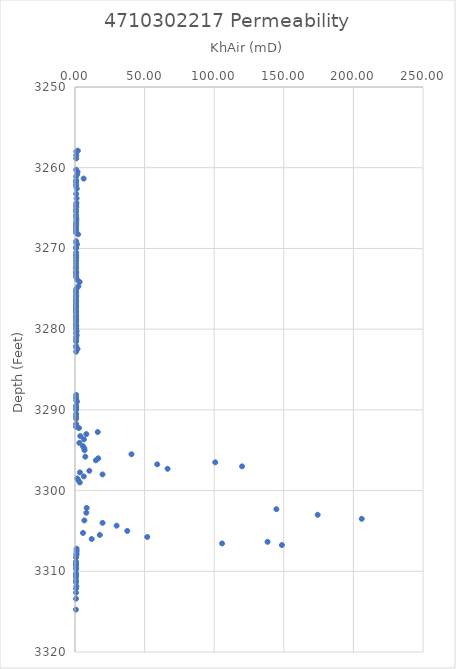
| Category | Series 0 |
|---|---|
| 2.063333333333333 | 3257.9 |
| 0.9273333333333333 | 3258 |
| 0.895 | 3258.45 |
| 0.8806666666666668 | 3258.85 |
| 0.8243333333333333 | 3260.25 |
| 1.8033333333333335 | 3260.5 |
| 1.6133333333333333 | 3260.8 |
| 0.8143333333333334 | 3261.1 |
| 6.219999999999999 | 3261.35 |
| 0.8426666666666667 | 3261.55 |
| 0.839 | 3261.75 |
| 0.8303333333333333 | 3262.05 |
| 0.8173333333333334 | 3262.3 |
| 1.2833333333333334 | 3262.6 |
| 0.8399999999999999 | 3263.25 |
| 1.14 | 3263.8 |
| 0.9983333333333334 | 3264.35 |
| 0.8763333333333333 | 3264.6 |
| 0.9203333333333333 | 3264.85 |
| 0.715 | 3265.2 |
| 0.8456666666666667 | 3265.5 |
| 0.7480000000000001 | 3265.9 |
| 0.916 | 3266.2 |
| 1.0076666666666667 | 3266.5 |
| 0.8683333333333333 | 3266.8 |
| 0.8593333333333333 | 3267 |
| 0.82 | 3267.2 |
| 0.773 | 3267.5 |
| 0.8116666666666666 | 3267.75 |
| 0.7546666666666667 | 3268.05 |
| 2.2066666666666666 | 3268.25 |
| 0.8376666666666667 | 3269.1 |
| 0.9536666666666666 | 3269.35 |
| 1.4666666666666668 | 3269.5 |
| 0.7753333333333333 | 3269.85 |
| 0.766 | 3270 |
| 0.8416666666666667 | 3270.5 |
| 0.8263333333333334 | 3270.8 |
| 0.8450000000000001 | 3271 |
| 0.883 | 3271.25 |
| 0.8003333333333332 | 3271.55 |
| 0.7949999999999999 | 3271.9 |
| 0.8026666666666666 | 3272.25 |
| 0.806 | 3272.5 |
| 0.8543333333333333 | 3272.9 |
| 0.86 | 3273 |
| 0.8353333333333334 | 3273.25 |
| 0.8306666666666667 | 3273.55 |
| 1.39 | 3273.85 |
| 3.313333333333333 | 3274.15 |
| 2.433333333333333 | 3274.7 |
| 0.9413333333333332 | 3275 |
| 0.7959999999999999 | 3275.25 |
| 0.809 | 3275.5 |
| 0.8256666666666667 | 3275.8 |
| 0.819 | 3276 |
| 0.8033333333333333 | 3276.35 |
| 0.8196666666666667 | 3276.5 |
| 0.793 | 3276.75 |
| 0.7923333333333334 | 3277 |
| 0.8073333333333332 | 3277.25 |
| 0.6886666666666666 | 3277.5 |
| 0.8273333333333333 | 3277.75 |
| 0.8176666666666667 | 3278 |
| 0.8370000000000001 | 3278.3 |
| 0.8109999999999999 | 3278.5 |
| 0.8533333333333334 | 3278.75 |
| 0.8606666666666666 | 3279 |
| 0.782 | 3279.35 |
| 0.8889999999999999 | 3279.55 |
| 0.8383333333333334 | 3279.75 |
| 0.8333333333333334 | 3280 |
| 1.1266666666666667 | 3280.25 |
| 0.843 | 3280.5 |
| 1.21 | 3280.75 |
| 0.8413333333333334 | 3281 |
| 0.8559999999999999 | 3281.25 |
| 0.835 | 3281.55 |
| 0.8446666666666666 | 3282.1 |
| 0.8620000000000001 | 3282.25 |
| 1.8266666666666669 | 3282.45 |
| 0.8310000000000001 | 3282.8 |
| 0.8303333333333334 | 3288.15 |
| 0.761 | 3288.5 |
| 0.9396666666666667 | 3288.8 |
| 1.3766666666666667 | 3289 |
| 0.7973333333333334 | 3289.5 |
| 0.8329999999999999 | 3289.75 |
| 0.8333333333333334 | 3290 |
| 0.8243333333333333 | 3290.5 |
| 0.779 | 3290.8 |
| 0.8303333333333334 | 3291.1 |
| 0.8016666666666667 | 3291.75 |
| 0.7559999999999999 | 3292.1 |
| 2.84 | 3292.25 |
| 16.333333333333332 | 3292.75 |
| 8.153333333333334 | 3293 |
| 3.8266666666666667 | 3293.25 |
| 6.4366666666666665 | 3293.65 |
| 3.11 | 3294.1 |
| 5.760000000000001 | 3294.5 |
| 6.670000000000001 | 3294.75 |
| 6.863333333333333 | 3295 |
| 40.56666666666667 | 3295.5 |
| 7.403333333333333 | 3295.8 |
| 16.7 | 3296 |
| 15.0 | 3296.25 |
| 100.76666666666667 | 3296.5 |
| 59.06666666666666 | 3296.75 |
| 120.0 | 3297 |
| 66.5 | 3297.3 |
| 10.299999999999999 | 3297.55 |
| 3.5366666666666666 | 3297.75 |
| 19.766666666666666 | 3298 |
| 6.32 | 3298.25 |
| 1.5833333333333333 | 3298.5 |
| 2.3633333333333337 | 3298.7 |
| 3.4566666666666666 | 3299 |
| 8.386666666666667 | 3302.15 |
| 144.66666666666666 | 3302.3 |
| 8.14 | 3302.75 |
| 174.33333333333334 | 3303 |
| 206.0 | 3303.5 |
| 6.740000000000001 | 3303.7 |
| 19.8 | 3304 |
| 29.899999999999995 | 3304.35 |
| 37.53333333333333 | 3305 |
| 5.753333333333333 | 3305.25 |
| 17.833333333333332 | 3305.5 |
| 51.93333333333334 | 3305.75 |
| 12.0 | 3306 |
| 138.33333333333334 | 3306.35 |
| 105.66666666666667 | 3306.55 |
| 148.66666666666666 | 3306.75 |
| 1.1500000000000001 | 3307.2 |
| 1.1900000000000002 | 3307.5 |
| 1.0633333333333332 | 3307.8 |
| 0.9756666666666667 | 3308 |
| 0.7629999999999999 | 3308.3 |
| 0.7573333333333334 | 3308.8 |
| 0.755 | 3309 |
| 0.7863333333333333 | 3309.2 |
| 0.793 | 3309.5 |
| 0.8273333333333334 | 3309.75 |
| 0.7623333333333333 | 3310.25 |
| 0.7673333333333333 | 3310.5 |
| 0.7286666666666667 | 3310.75 |
| 0.7346666666666667 | 3311.15 |
| 0.7479999999999999 | 3311.35 |
| 1.0063333333333333 | 3311.85 |
| 0.7080000000000001 | 3312.15 |
| 0.7481 | 3312.65 |
| 0.6953333333333332 | 3313.4 |
| 0.6466666666666666 | 3314.75 |